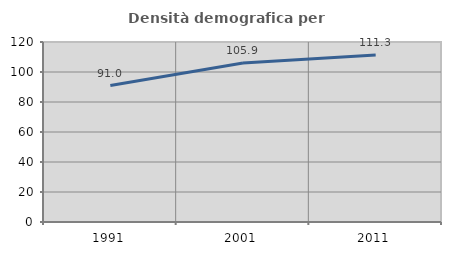
| Category | Densità demografica |
|---|---|
| 1991.0 | 90.991 |
| 2001.0 | 105.942 |
| 2011.0 | 111.282 |